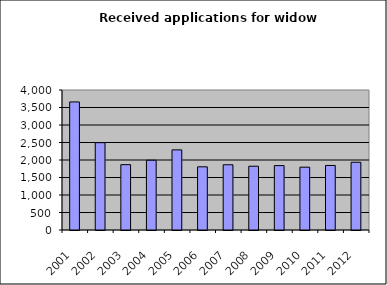
| Category | Series 1 |
|---|---|
| 2001.0 | 3659 |
| 2002.0 | 2495 |
| 2003.0 | 1867 |
| 2004.0 | 1993 |
| 2005.0 | 2289 |
| 2006.0 | 1805 |
| 2007.0 | 1864 |
| 2008.0 | 1822 |
| 2009.0 | 1840 |
| 2010.0 | 1795 |
| 2011.0 | 1844 |
| 2012.0 | 1936 |